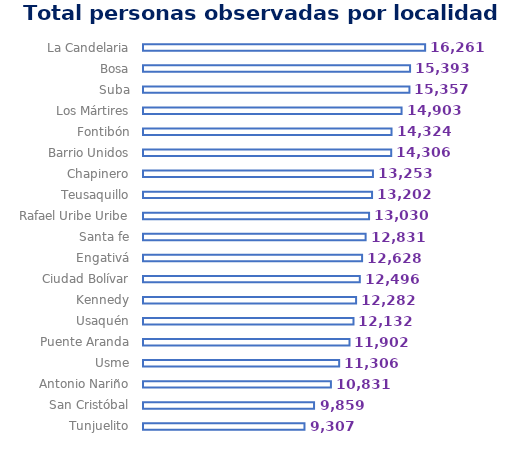
| Category | T Personas  |
|---|---|
| La Candelaria | 16261 |
| Bosa | 15393 |
| Suba | 15357 |
| Los Mártires | 14903 |
| Fontibón | 14324 |
| Barrio Unidos | 14306 |
| Chapinero | 13253 |
| Teusaquillo | 13202 |
| Rafael Uribe Uribe | 13030 |
| Santa fe | 12831 |
| Engativá | 12628 |
| Ciudad Bolívar | 12496 |
| Kennedy | 12282 |
| Usaquén | 12132 |
| Puente Aranda | 11902 |
| Usme | 11306 |
| Antonio Nariño | 10831 |
| San Cristóbal | 9859 |
| Tunjuelito | 9307 |